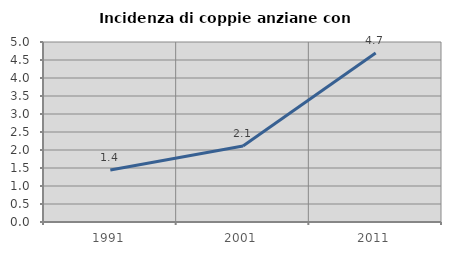
| Category | Incidenza di coppie anziane con figli |
|---|---|
| 1991.0 | 1.442 |
| 2001.0 | 2.11 |
| 2011.0 | 4.692 |